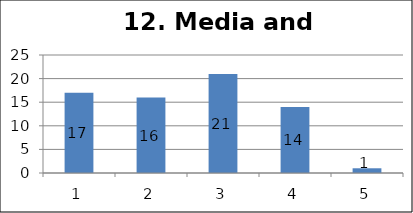
| Category | Series 1 |
|---|---|
| 0 | 17 |
| 1 | 16 |
| 2 | 21 |
| 3 | 14 |
| 4 | 1 |